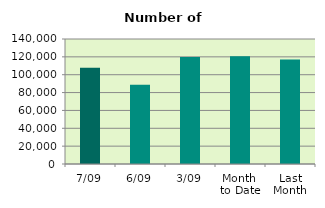
| Category | Series 0 |
|---|---|
| 7/09 | 107822 |
| 6/09 | 88750 |
| 3/09 | 119830 |
| Month 
to Date | 120756.4 |
| Last
Month | 117090.273 |